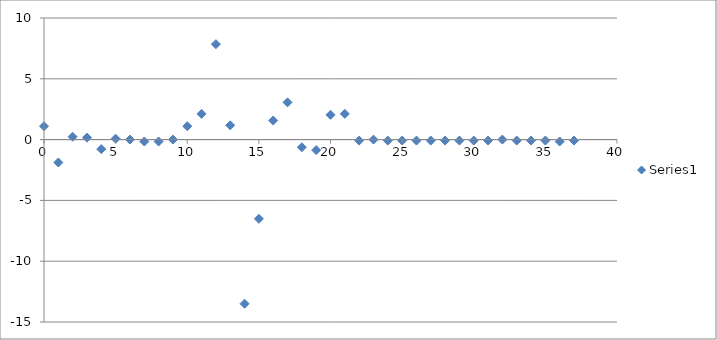
| Category | Series 0 |
|---|---|
| 0.0 | 1.099 |
| 1.0 | -1.884 |
| 2.0 | 0.235 |
| 3.0 | 0.157 |
| 4.0 | -0.785 |
| 5.0 | 0.078 |
| 6.0 | 0 |
| 7.0 | -0.157 |
| 8.0 | -0.157 |
| 9.0 | 0 |
| 10.0 | 1.099 |
| 11.0 | 2.119 |
| 12.0 | 7.848 |
| 13.0 | 1.177 |
| 14.0 | -13.499 |
| 15.0 | -6.514 |
| 16.0 | 1.57 |
| 17.0 | 3.061 |
| 18.0 | -0.628 |
| 19.0 | -0.863 |
| 20.0 | 2.041 |
| 21.0 | 2.119 |
| 22.0 | -0.078 |
| 23.0 | 0 |
| 24.0 | -0.078 |
| 25.0 | -0.078 |
| 26.0 | -0.078 |
| 27.0 | -0.078 |
| 28.0 | -0.078 |
| 29.0 | -0.078 |
| 30.0 | -0.078 |
| 31.0 | -0.078 |
| 32.0 | 0 |
| 33.0 | -0.078 |
| 34.0 | -0.078 |
| 35.0 | -0.078 |
| 36.0 | -0.157 |
| 37.0 | -0.078 |